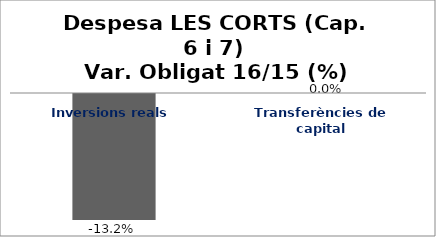
| Category | Series 0 |
|---|---|
| Inversions reals | -0.132 |
| Transferències de capital | 0 |